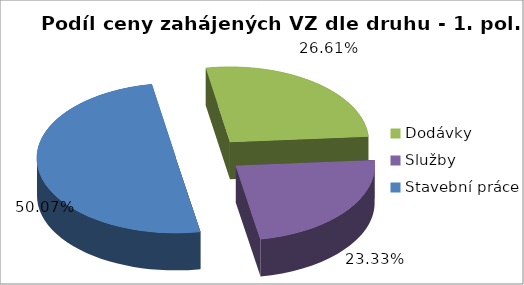
| Category | Series 0 |
|---|---|
| Dodávky | 28187.434 |
| Služby | 24708.557 |
| Stavební práce | 53035.145 |